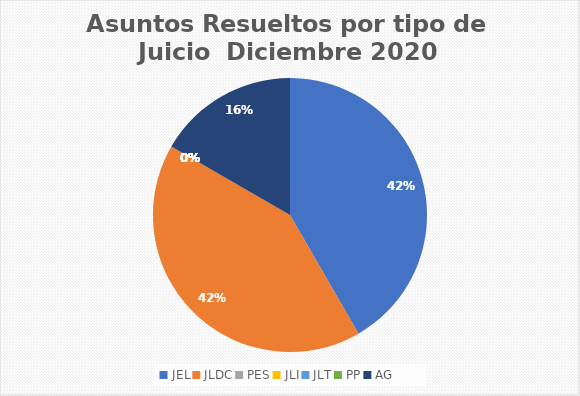
| Category | Asuntos Resueltos por tipo de Juicio  Diciembre |
|---|---|
| JEL | 5 |
| JLDC | 5 |
| PES | 0 |
| JLI | 0 |
| JLT | 0 |
| PP | 0 |
| AG | 2 |